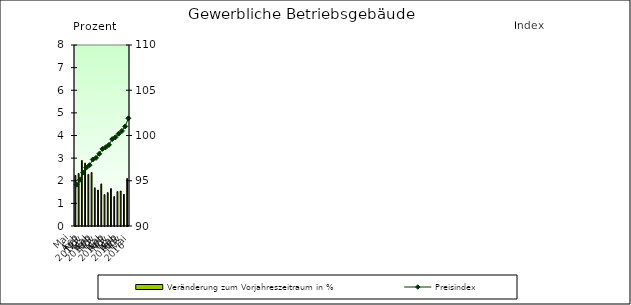
| Category | Veränderung zum Vorjahreszeitraum in % |
|---|---|
| 0 | 2.237 |
| 1 | 2.323 |
| 2 | 2.896 |
| 3 | 2.78 |
| 4 | 2.284 |
| 5 | 2.365 |
| 6 | 1.689 |
| 7 | 1.586 |
| 8 | 1.86 |
| 9 | 1.386 |
| 10 | 1.476 |
| 11 | 1.653 |
| 12 | 1.299 |
| 13 | 1.519 |
| 14 | 1.546 |
| 15 | 1.4 |
| 16 | 2.1 |